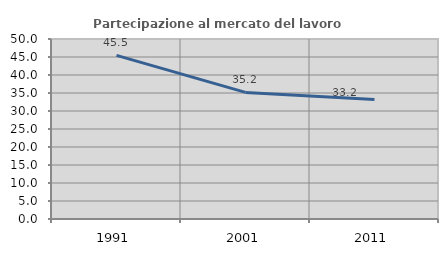
| Category | Partecipazione al mercato del lavoro  femminile |
|---|---|
| 1991.0 | 45.455 |
| 2001.0 | 35.159 |
| 2011.0 | 33.175 |